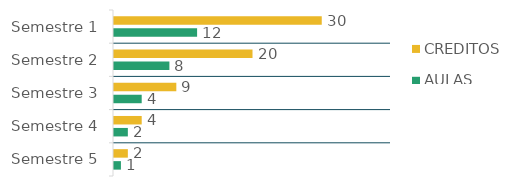
| Category | CRÉDITOS  | AULAS  |
|---|---|---|
| Semestre 1 | 30 | 12 |
| Semestre 2 | 20 | 8 |
| Semestre 3 | 9 | 4 |
| Semestre 4 | 4 | 2 |
| Semestre 5 | 2 | 1 |